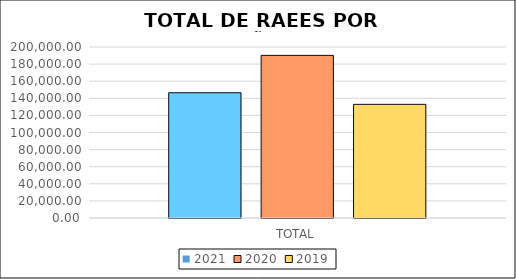
| Category | 2021 | 2020 | 2019 |
|---|---|---|---|
| TOTAL | 146505 | 190197 | 132920.75 |